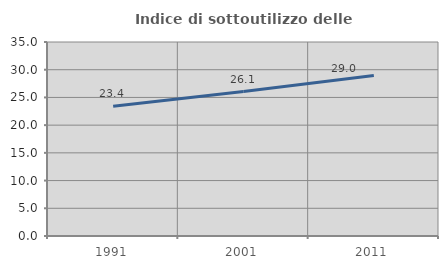
| Category | Indice di sottoutilizzo delle abitazioni  |
|---|---|
| 1991.0 | 23.423 |
| 2001.0 | 26.063 |
| 2011.0 | 28.97 |